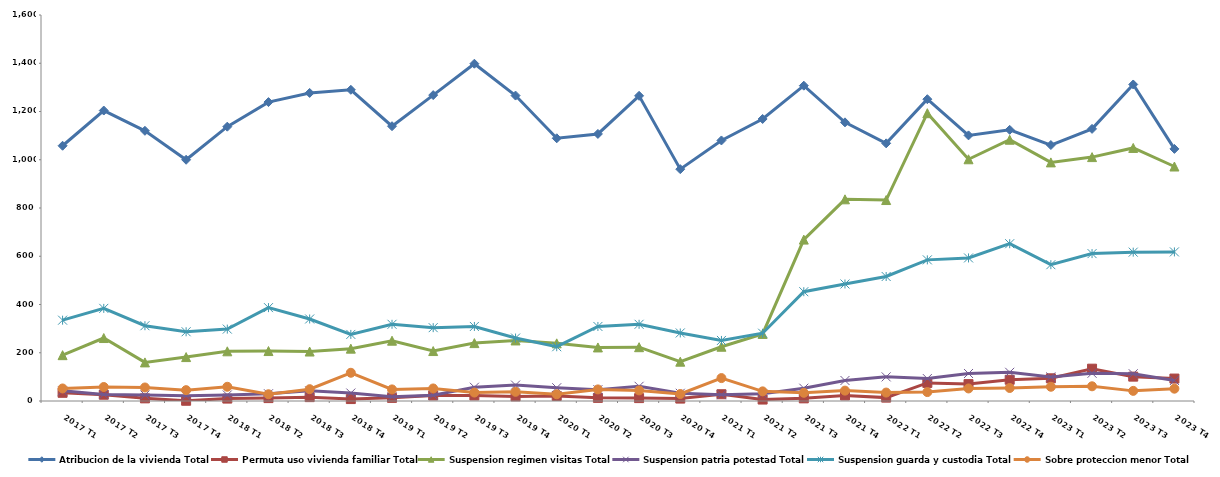
| Category | Atribucion de la vivienda Total | Permuta uso vivienda familiar Total | Suspension regimen visitas Total | Suspension patria potestad Total | Suspension guarda y custodia Total | Sobre proteccion menor Total |
|---|---|---|---|---|---|---|
| 2017 T1 | 1058 | 34 | 190 | 42 | 335 | 52 |
| 2017 T2 | 1204 | 26 | 261 | 27 | 384 | 58 |
| 2017 T3 | 1120 | 11 | 160 | 25 | 312 | 56 |
| 2017 T4 | 1000 | 1 | 182 | 22 | 287 | 45 |
| 2018 T1 | 1137 | 10 | 206 | 25 | 298 | 59 |
| 2018 T2 | 1239 | 12 | 207 | 30 | 387 | 28 |
| 2018 T3 | 1277 | 16 | 205 | 42 | 340 | 49 |
| 2018 T4 | 1290 | 8 | 217 | 33 | 276 | 117 |
| 2019 T1 | 1139 | 13 | 250 | 18 | 318 | 48 |
| 2019 T2 | 1268 | 23 | 207 | 24 | 304 | 52 |
| 2019 T3 | 1398 | 23 | 240 | 57 | 309 | 35 |
| 2019 T4 | 1266 | 19 | 251 | 66 | 261 | 38 |
| 2020 T1 | 1089 | 21 | 239 | 55 | 225 | 28 |
| 2020 T2 | 1107 | 13 | 222 | 47 | 309 | 48 |
| 2020 T3 | 1265 | 12 | 223 | 61 | 318 | 44 |
| 2020 T4 | 961 | 10 | 163 | 32 | 282 | 29 |
| 2021 T1 | 1080 | 28 | 225 | 26 | 251 | 95 |
| 2021 T2 | 1169 | 6 | 278 | 30 | 281 | 40 |
| 2021 T3 | 1307 | 11 | 669 | 53 | 453 | 34 |
| 2021 T4 | 1155 | 23 | 836 | 85 | 485 | 43 |
| 2022 T1 | 1068 | 14 | 833 | 100 | 516 | 35 |
| 2022 T2 | 1251 | 75 | 1193 | 93 | 585 | 37 |
| 2022 T3 | 1101 | 70 | 1002 | 114 | 593 | 52 |
| 2022 T4 | 1124 | 88 | 1083 | 119 | 652 | 54 |
| 2023 T1 | 1061 | 94 | 989 | 100 | 565 | 59 |
| 2023 T2 | 1128 | 134 | 1011 | 115 | 611 | 61 |
| 2023 T3 | 1312 | 101 | 1049 | 113 | 617 | 42 |
| 2023 T4 | 1045 | 93 | 972 | 85 | 618 | 51 |